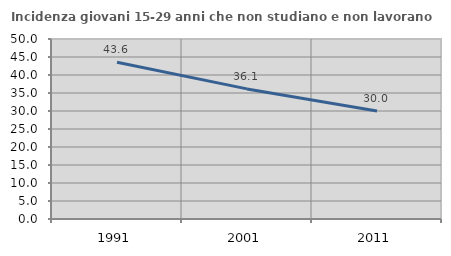
| Category | Incidenza giovani 15-29 anni che non studiano e non lavorano  |
|---|---|
| 1991.0 | 43.556 |
| 2001.0 | 36.139 |
| 2011.0 | 30 |